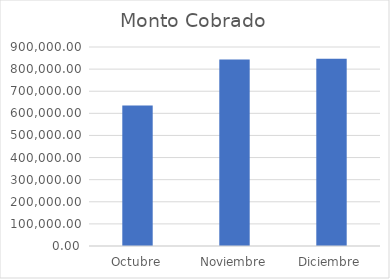
| Category | Monto Cobrado |
|---|---|
| Octubre | 635207 |
| Noviembre | 842954.25 |
| Diciembre | 846764 |